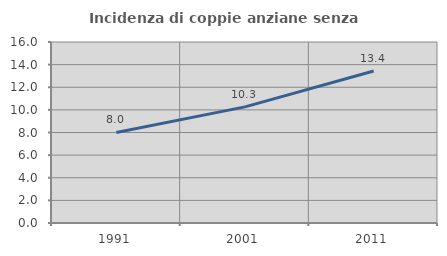
| Category | Incidenza di coppie anziane senza figli  |
|---|---|
| 1991.0 | 8.002 |
| 2001.0 | 10.265 |
| 2011.0 | 13.438 |